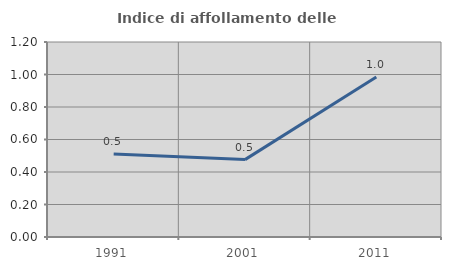
| Category | Indice di affollamento delle abitazioni  |
|---|---|
| 1991.0 | 0.51 |
| 2001.0 | 0.476 |
| 2011.0 | 0.985 |